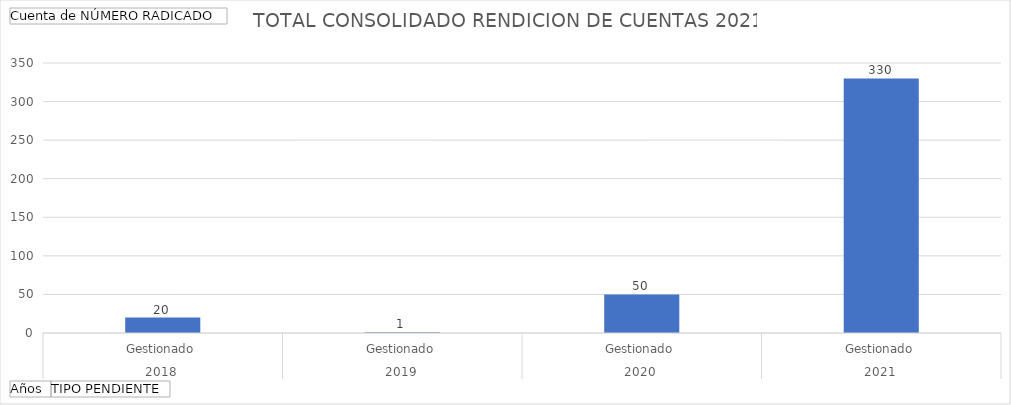
| Category | Total |
|---|---|
| 0 | 20 |
| 1 | 1 |
| 2 | 50 |
| 3 | 330 |